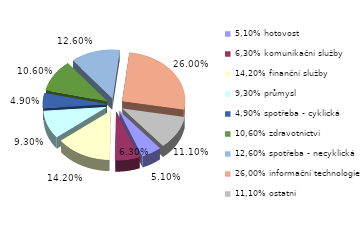
| Category | Series 0 |
|---|---|
| 5,10% hotovost | 0.051 |
| 6,30% komunikační služby | 0.063 |
| 14,20% finanční služby | 0.142 |
| 9,30% průmysl | 0.093 |
| 4,90% spotřeba - cyklická | 0.049 |
| 10,60% zdravotnictví | 0.106 |
| 12,60% spotřeba - necyklická | 0.126 |
| 26,00% informační technologie | 0.26 |
| 11,10% ostatní | 0.111 |